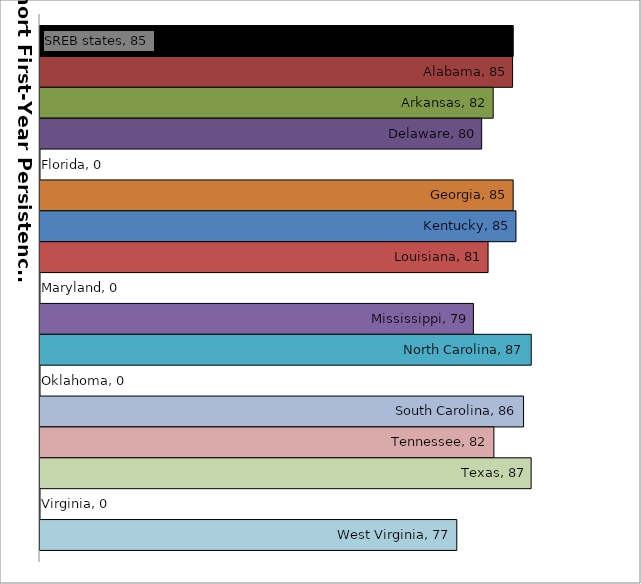
| Category | SREB states | Alabama | Arkansas | Delaware | Florida | Georgia | Kentucky | Louisiana | Maryland | Mississippi | North Carolina | Oklahoma | South Carolina | Tennessee | Texas | Virginia | West Virginia |
|---|---|---|---|---|---|---|---|---|---|---|---|---|---|---|---|---|---|
| 0 | 84.604 | 84.516 | 81.87 | 80.295 | 0 | 84.595 | 84.975 | 81.169 | 0 | 79.164 | 87.063 | 0 | 86.015 | 81.968 | 87.049 | 0 | 76.9 |